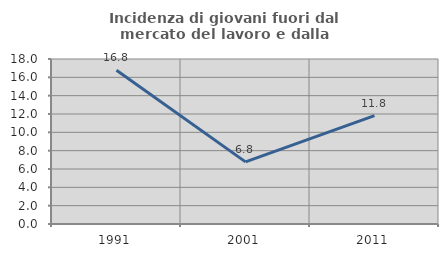
| Category | Incidenza di giovani fuori dal mercato del lavoro e dalla formazione  |
|---|---|
| 1991.0 | 16.766 |
| 2001.0 | 6.78 |
| 2011.0 | 11.828 |